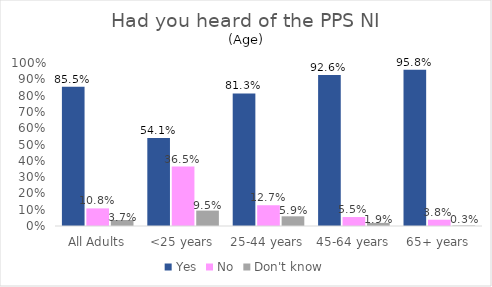
| Category | Yes | No | Don't know |
|---|---|---|---|
| All Adults | 0.855 | 0.108 | 0.037 |
| <25 years | 0.541 | 0.365 | 0.095 |
| 25-44 years | 0.813 | 0.127 | 0.059 |
| 45-64 years | 0.926 | 0.055 | 0.019 |
| 65+ years | 0.958 | 0.038 | 0.003 |